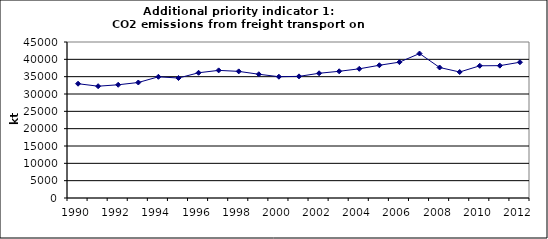
| Category | CO2 emissions from freight transport on road, kt  |
|---|---|
| 1990 | 32967.733 |
| 1991 | 32249.221 |
| 1992 | 32659.3 |
| 1993 | 33317.747 |
| 1994 | 34959.991 |
| 1995 | 34609.026 |
| 1996 | 36125.209 |
| 1997 | 36816.531 |
| 1998 | 36521.983 |
| 1999 | 35699.565 |
| 2000 | 34987.49 |
| 2001 | 35084.962 |
| 2002 | 35977.483 |
| 2003 | 36551.49 |
| 2004 | 37264.219 |
| 2005 | 38290.394 |
| 2006 | 39185.776 |
| 2007 | 41670.208 |
| 2008 | 37647.131 |
| 2009 | 36343.503 |
| 2010 | 38135.568 |
| 2011 | 38178.018 |
| 2012 | 39163.538 |